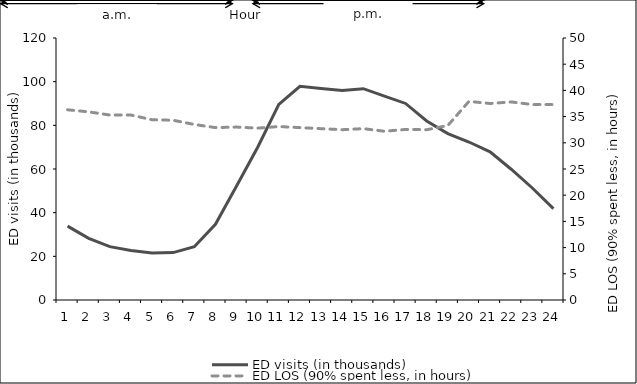
| Category | ED visits (in thousands) |
|---|---|
| 0 | 33.831 |
| 1 | 28.213 |
| 2 | 24.45 |
| 3 | 22.651 |
| 4 | 21.499 |
| 5 | 21.71 |
| 6 | 24.374 |
| 7 | 34.685 |
| 8 | 52.235 |
| 9 | 69.947 |
| 10 | 89.572 |
| 11 | 97.901 |
| 12 | 96.864 |
| 13 | 95.943 |
| 14 | 96.785 |
| 15 | 93.397 |
| 16 | 90.021 |
| 17 | 82.022 |
| 18 | 76.222 |
| 19 | 72.36 |
| 20 | 67.842 |
| 21 | 59.885 |
| 22 | 51.307 |
| 23 | 41.819 |